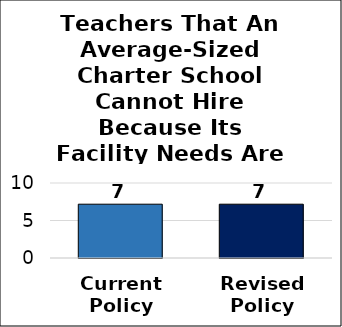
| Category | Number of Additional Teachers Hired |
|---|---|
| Current
Policy | 7.175 |
| Revised
Policy | 7.175 |